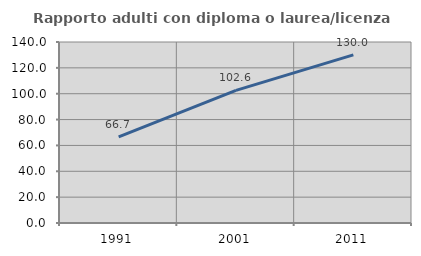
| Category | Rapporto adulti con diploma o laurea/licenza media  |
|---|---|
| 1991.0 | 66.667 |
| 2001.0 | 102.582 |
| 2011.0 | 130 |